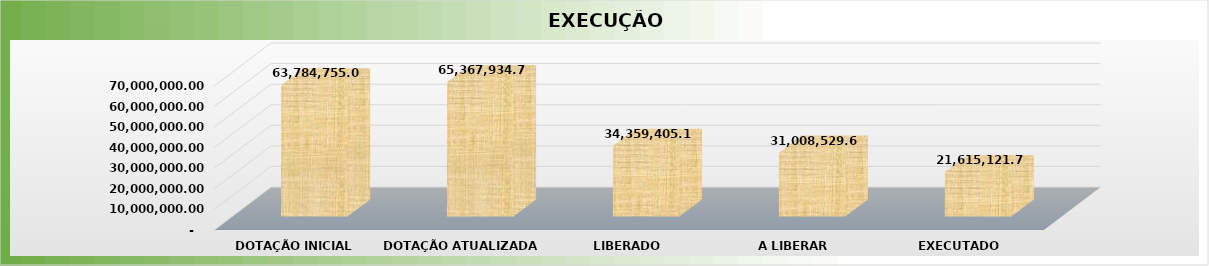
| Category | Series 0 |
|---|---|
| 0 | 63784755 |
| 1 | 65367934.77 |
| 2 | 34359405.14 |
| 3 | 31008529.63 |
| 4 | 21615121.75 |